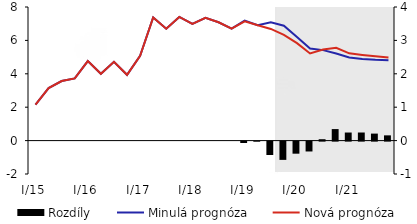
| Category | Rozdíly |
|---|---|
| I/15 | 0 |
| II | 0 |
| III | 0 |
| IV | 0 |
| I/16 | 0 |
| II | 0 |
| III | 0 |
| IV | 0 |
| I/17 | 0 |
| II | 0 |
| III | 0 |
| IV | 0 |
| I/18 | 0 |
| II | 0 |
| III | 0 |
| IV | 0 |
| I/19 | -0.041 |
| II | -0.003 |
| III | -0.401 |
| IV | -0.547 |
| I/20 | -0.362 |
| II | -0.296 |
| III | 0.041 |
| IV | 0.345 |
| I/21 | 0.242 |
| II | 0.242 |
| III | 0.21 |
| IV | 0.157 |